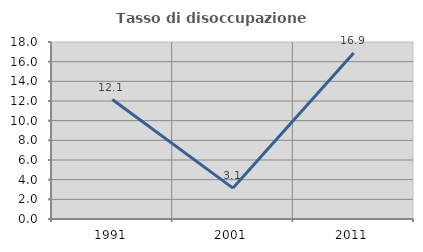
| Category | Tasso di disoccupazione giovanile  |
|---|---|
| 1991.0 | 12.148 |
| 2001.0 | 3.141 |
| 2011.0 | 16.883 |